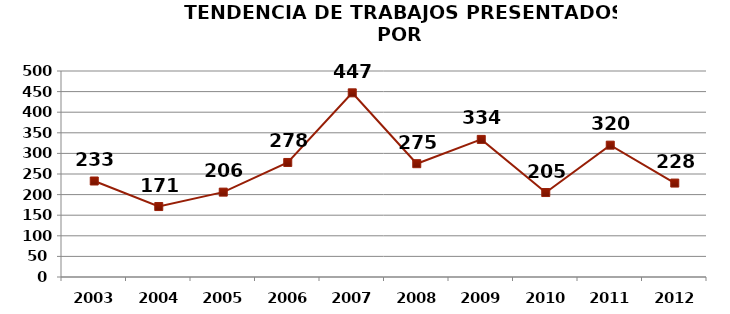
| Category | Planta |
|---|---|
| 2003.0 | 233 |
| 2004.0 | 171 |
| 2005.0 | 206 |
| 2006.0 | 278 |
| 2007.0 | 447 |
| 2008.0 | 275 |
| 2009.0 | 334 |
| 2010.0 | 205 |
| 2011.0 | 320 |
| 2012.0 | 228 |